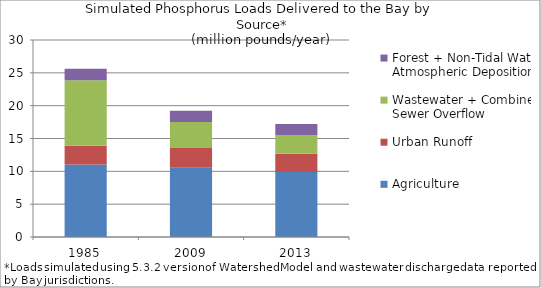
| Category | Agriculture | Urban Runoff | Wastewater + Combined Sewer Overflow | Forest + Non-Tidal Water Atmospheric Deposition |
|---|---|---|---|---|
| 1985.0 | 11.028 | 2.881 | 9.978 | 1.733 |
| 2009.0 | 10.546 | 3.01 | 3.972 | 1.701 |
| 2013.0 | 9.884 | 2.812 | 2.809 | 1.684 |